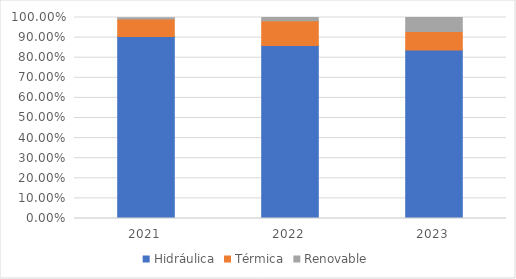
| Category | Hidráulica | Térmica | Renovable |
|---|---|---|---|
| 2021.0 | 0.906 | 0.087 | 0.006 |
| 2022.0 | 0.861 | 0.123 | 0.017 |
| 2023.0 | 0.838 | 0.092 | 0.07 |